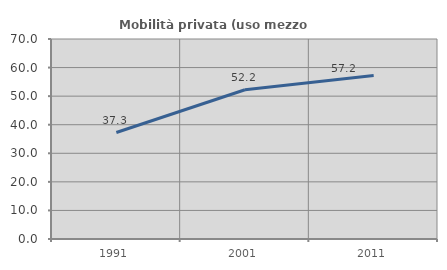
| Category | Mobilità privata (uso mezzo privato) |
|---|---|
| 1991.0 | 37.273 |
| 2001.0 | 52.242 |
| 2011.0 | 57.243 |